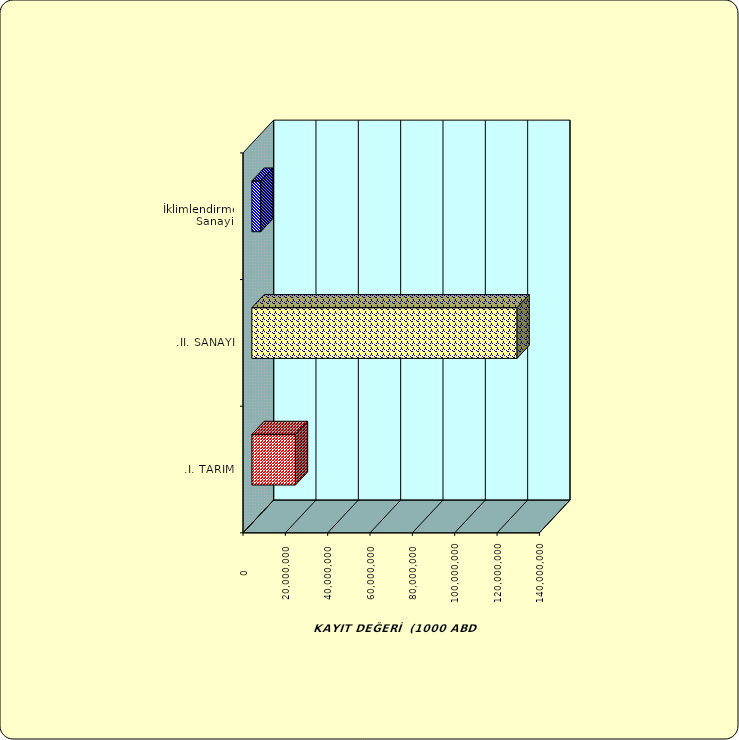
| Category | Series 0 |
|---|---|
| .I. TARIM | 20574507.536 |
| .II. SANAYİ | 125277010.464 |
|  İklimlendirme Sanayii | 4181573.691 |